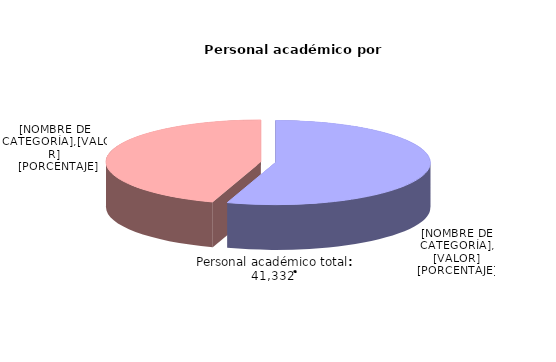
| Category | Series 0 | Series 1 |
|---|---|---|
| Hombres | 22742 | 55.023 |
| Mujeres | 18590 | 44.977 |